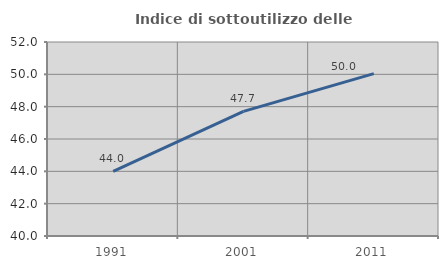
| Category | Indice di sottoutilizzo delle abitazioni  |
|---|---|
| 1991.0 | 44 |
| 2001.0 | 47.712 |
| 2011.0 | 50.044 |